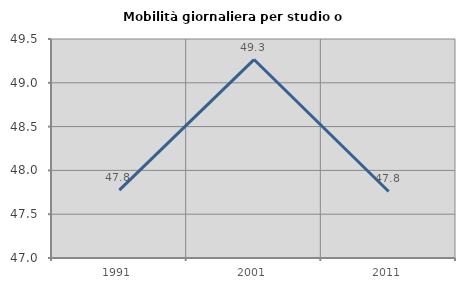
| Category | Mobilità giornaliera per studio o lavoro |
|---|---|
| 1991.0 | 47.775 |
| 2001.0 | 49.265 |
| 2011.0 | 47.76 |